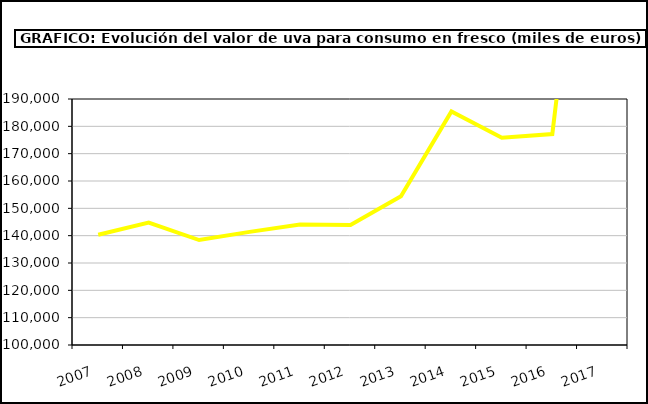
| Category | producción |
|---|---|
| 2007.0 | 140324.353 |
| 2008.0 | 144818.305 |
| 2009.0 | 138393.399 |
| 2010.0 | 141387.824 |
| 2011.0 | 144079.533 |
| 2012.0 | 143929.55 |
| 2013.0 | 154416.832 |
| 2014.0 | 185423.908 |
| 2015.0 | 175844 |
| 2016.0 | 177191 |
| 2017.0 | 331249.606 |